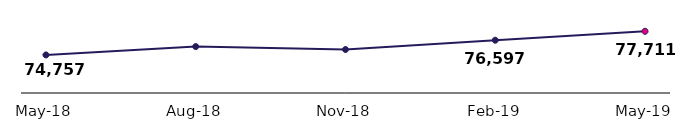
| Category | Claimant receiving benefit |
|---|---|
| 2018-05-01 | 74757 |
| 2018-08-01 | 75805 |
| 2018-11-01 | 75437 |
| 2019-02-01 | 76597 |
| 2019-05-01 | 77711 |